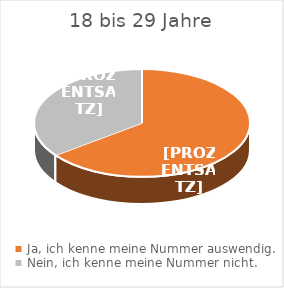
| Category | 18–29 Jahre |
|---|---|
| Ja, ich kenne meine Nummer auswendig. | 64.8 |
| Nein, ich kenne meine Nummer nicht.  | 35.2 |